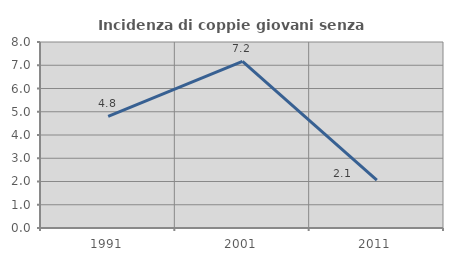
| Category | Incidenza di coppie giovani senza figli |
|---|---|
| 1991.0 | 4.802 |
| 2001.0 | 7.163 |
| 2011.0 | 2.059 |